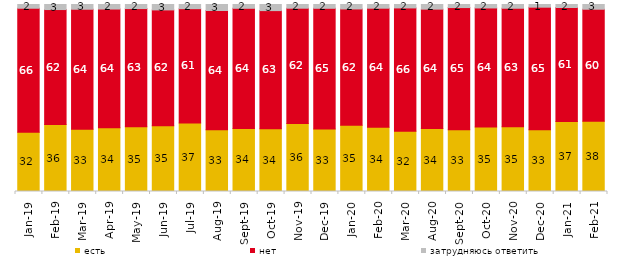
| Category | есть | нет | затрудняюсь ответить |
|---|---|---|---|
| 2019-01-01 | 31.75 | 66.25 | 2 |
| 2019-02-01 | 35.8 | 61.5 | 2.7 |
| 2019-03-01 | 33.317 | 64.147 | 2.536 |
| 2019-04-01 | 34.059 | 63.515 | 2.426 |
| 2019-05-01 | 34.621 | 63.2 | 2.179 |
| 2019-06-01 | 35.162 | 61.945 | 2.893 |
| 2019-07-01 | 36.634 | 61.139 | 2.228 |
| 2019-08-01 | 33.067 | 63.736 | 3.197 |
| 2019-09-01 | 33.713 | 64.257 | 2.03 |
| 2019-10-01 | 33.564 | 63.168 | 3.267 |
| 2019-11-01 | 36.337 | 61.683 | 1.98 |
| 2019-12-01 | 33.416 | 64.554 | 2.03 |
| 2020-01-01 | 35.446 | 62.178 | 2.376 |
| 2020-02-01 | 34.307 | 63.713 | 1.98 |
| 2020-03-01 | 32.226 | 65.94 | 1.834 |
| 2020-08-01 | 33.664 | 63.853 | 2.483 |
| 2020-09-01 | 33.051 | 65.306 | 1.643 |
| 2020-10-01 | 34.529 | 63.627 | 1.844 |
| 2020-11-01 | 34.6 | 63.4 | 2 |
| 2020-12-01 | 33.069 | 65.493 | 1.438 |
| 2021-01-01 | 37.407 | 61.003 | 1.59 |
| 2021-02-01 | 37.618 | 59.851 | 2.531 |